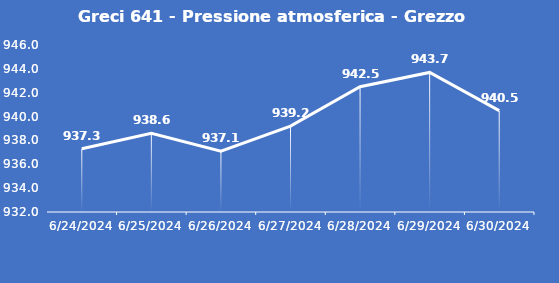
| Category | Greci 641 - Pressione atmosferica - Grezzo (hPa) |
|---|---|
| 6/24/24 | 937.3 |
| 6/25/24 | 938.6 |
| 6/26/24 | 937.1 |
| 6/27/24 | 939.2 |
| 6/28/24 | 942.5 |
| 6/29/24 | 943.7 |
| 6/30/24 | 940.5 |